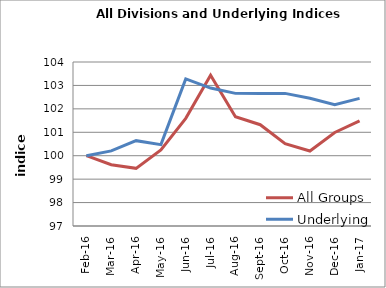
| Category | All Groups | Underlying |
|---|---|---|
| 2016-02-01 | 100 | 100 |
| 2016-03-01 | 99.613 | 100.206 |
| 2016-04-01 | 99.461 | 100.642 |
| 2016-05-01 | 100.244 | 100.472 |
| 2016-06-01 | 101.595 | 103.278 |
| 2016-07-01 | 103.435 | 102.887 |
| 2016-08-01 | 101.664 | 102.661 |
| 2016-09-01 | 101.323 | 102.652 |
| 2016-10-01 | 100.517 | 102.66 |
| 2016-11-01 | 100.201 | 102.451 |
| 2016-12-01 | 100.991 | 102.18 |
| 2017-01-01 | 101.49 | 102.449 |